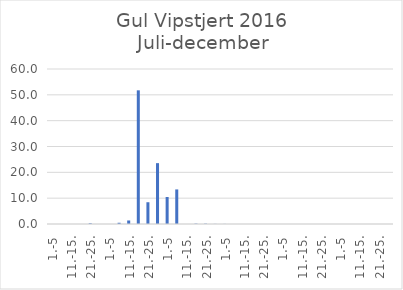
| Category | Series 0 |
|---|---|
| 1.-5 | 0 |
| 6.-10. | 0 |
| 11.-15. | 0 |
| 16.-20. | 0 |
| 21.-25. | 0.265 |
| 26.-31. | 0 |
| 1.-5 | 0 |
| 6.-10. | 0.478 |
| 11.-15. | 1.367 |
| 16.-20. | 51.746 |
| 21.-25. | 8.426 |
| 26.-31. | 23.557 |
| 1.-5 | 10.457 |
| 6.-10. | 13.38 |
| 11.-15. | 0 |
| 16.-20. | 0.14 |
| 21.-25. | 0.128 |
| 26.-30. | 0.043 |
| 1.-5 | 0.035 |
| 6.-10. | 0 |
| 11.-15. | 0 |
| 16.-20. | 0 |
| 21.-25. | 0 |
| 26.-31. | 0 |
| 1.-5 | 0 |
| 6.-10. | 0 |
| 11.-15. | 0 |
| 16.-20. | 0 |
| 21.-25. | 0 |
| 26.-30. | 0 |
| 1.-5 | 0 |
| 6.-10. | 0 |
| 11.-15. | 0 |
| 16.-20. | 0 |
| 21.-25. | 0 |
| 26.-31. | 0 |